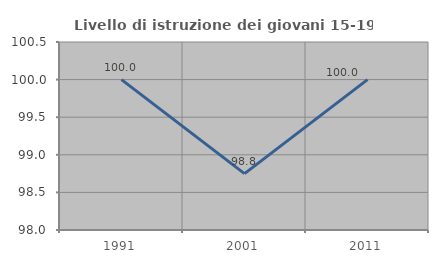
| Category | Livello di istruzione dei giovani 15-19 anni |
|---|---|
| 1991.0 | 100 |
| 2001.0 | 98.75 |
| 2011.0 | 100 |